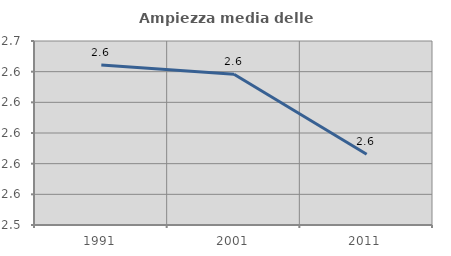
| Category | Ampiezza media delle famiglie |
|---|---|
| 1991.0 | 2.644 |
| 2001.0 | 2.638 |
| 2011.0 | 2.586 |